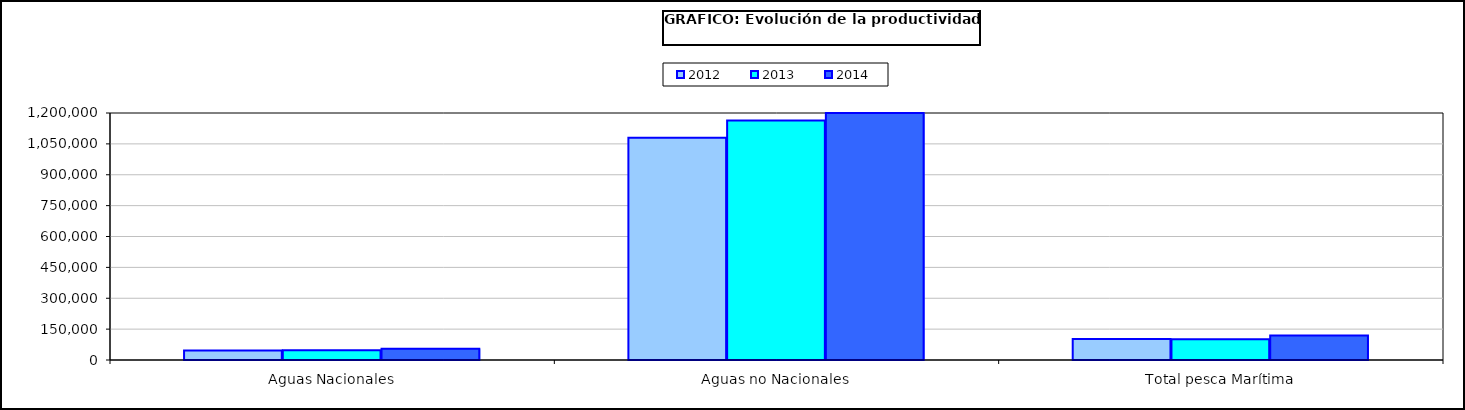
| Category | 2012 | 2013 | 2014 |
|---|---|---|---|
| 0 | 46383.969 | 47026.449 | 54963.776 |
| 1 | 1079739.644 | 1163471.318 | 1398413.776 |
| 2 | 102062.706 | 101103.255 | 119254.033 |